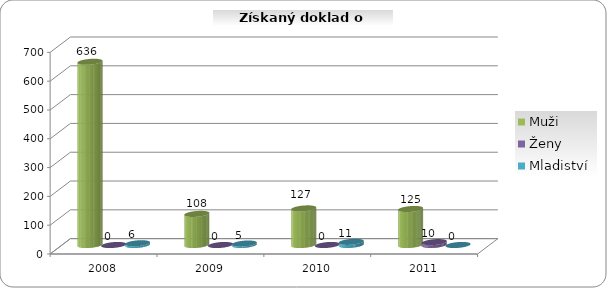
| Category | Muži | Ženy | Mladiství |
|---|---|---|---|
| 2008.0 | 636 | 0 | 6 |
| 2009.0 | 108 | 0 | 5 |
| 2010.0 | 127 | 0 | 11 |
| 2011.0 | 125 | 10 | 0 |